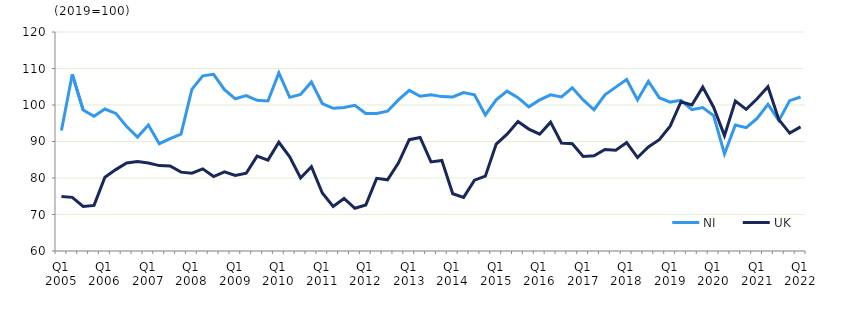
| Category | NI | UK  |
|---|---|---|
| Q1 2005 | 93 | 74.9 |
|  | 108.4 | 74.7 |
| Q3 2005 | 98.6 | 72.2 |
|  | 96.9 | 72.5 |
| Q1 2006 | 98.9 | 80.2 |
|  | 97.7 | 82.3 |
| Q3 2006 | 94.1 | 84.1 |
|  | 91.2 | 84.5 |
| Q1 2007 | 94.5 | 84.1 |
|  | 89.4 | 83.4 |
| Q3 2007 | 90.8 | 83.3 |
|  | 92 | 81.6 |
| Q1 2008 | 104.3 | 81.3 |
|  | 108 | 82.5 |
| Q3 2008 | 108.4 | 80.4 |
|  | 104.2 | 81.7 |
| Q1 2009 | 101.7 | 80.7 |
|  | 102.6 | 81.3 |
| Q3 2009 | 101.3 | 86 |
|  | 101.1 | 84.9 |
| Q1 2010 | 108.8 | 89.8 |
|  | 102.1 | 85.8 |
| Q3 2010 | 102.9 | 80 |
|  | 106.3 | 83.1 |
| Q1 2011 | 100.4 | 75.9 |
|  | 99.1 | 72.2 |
| Q3 2011 | 99.3 | 74.4 |
|  | 99.9 | 71.7 |
| Q1 2012 | 97.7 | 72.6 |
|  | 97.7 | 79.9 |
| Q3 2012 | 98.3 | 79.5 |
|  | 101.4 | 84.1 |
| Q1 2013 | 104 | 90.5 |
|  | 102.4 | 91.1 |
| Q3 2013 | 102.8 | 84.4 |
|  | 102.3 | 84.8 |
| Q1 2014 | 102.2 | 75.7 |
|  | 103.4 | 74.7 |
| Q3 2014 | 102.8 | 79.4 |
|  | 97.3 | 80.5 |
| Q1 2015 | 101.4 | 89.3 |
|  | 103.8 | 92 |
| Q3 2015 | 102 | 95.5 |
|  | 99.5 | 93.4 |
| Q1 2016 | 101.4 | 92 |
|  | 102.8 | 95.3 |
| Q3 2016 | 102.2 | 89.6 |
|  | 104.7 | 89.4 |
| Q1 2017 | 101.4 | 85.9 |
|  | 98.7 | 86.1 |
| Q3 2017 | 102.8 | 87.8 |
|  | 104.9 | 87.6 |
| Q1 2018 | 107 | 89.7 |
|  | 101.4 | 85.6 |
| Q3 2018 | 106.5 | 88.5 |
|  | 102 | 90.5 |
| Q1 2019 | 100.8 | 94.2 |
|  | 101.3 | 100.9 |
| Q3 2019 | 98.7 | 100 |
|  | 99.3 | 104.9 |
| Q1 2020 | 97.1 | 99.4 |
|  | 86.6 | 91.6 |
| Q3 2020 | 94.5 | 101.1 |
|  | 93.8 | 98.8 |
| Q1 2021 | 96.3 | 101.7 |
|  | 100.2 | 105 |
| Q3 2021 | 95.7 | 96 |
|  | 101.2 | 92.3 |
| Q1 2022 | 102.2 | 94 |